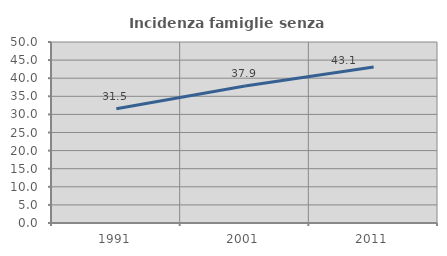
| Category | Incidenza famiglie senza nuclei |
|---|---|
| 1991.0 | 31.539 |
| 2001.0 | 37.857 |
| 2011.0 | 43.068 |